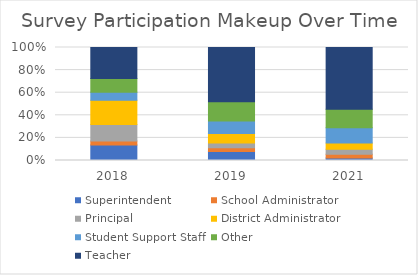
| Category | Superintendent | School Administrator | Principal | District Administrator | Student Support Staff | Other | Teacher |
|---|---|---|---|---|---|---|---|
| 2018.0 | 0.138 | 0.035 | 0.146 | 0.213 | 0.071 | 0.122 | 0.274 |
| 2019.0 | 0.079 | 0.033 | 0.043 | 0.084 | 0.111 | 0.17 | 0.48 |
| 2021.0 | 0.023 | 0.033 | 0.045 | 0.055 | 0.134 | 0.165 | 0.546 |